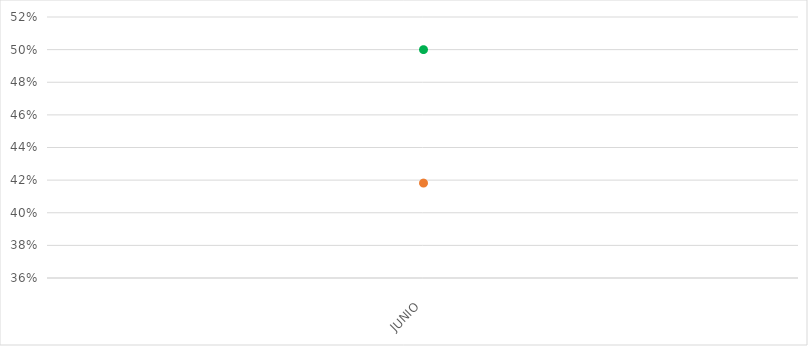
| Category | VALOR  | META PONDERADA |
|---|---|---|
| JUNIO | 0.418 | 0.5 |